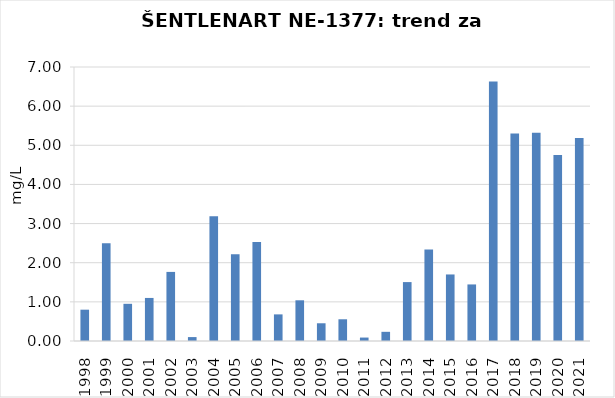
| Category | Vsota |
|---|---|
| 1998 | 0.8 |
| 1999 | 2.5 |
| 2000 | 0.95 |
| 2001 | 1.1 |
| 2002 | 1.765 |
| 2003 | 0.1 |
| 2004 | 3.19 |
| 2005 | 2.215 |
| 2006 | 2.53 |
| 2007 | 0.68 |
| 2008 | 1.04 |
| 2009 | 0.453 |
| 2010 | 0.555 |
| 2011 | 0.088 |
| 2012 | 0.234 |
| 2013 | 1.505 |
| 2014 | 2.335 |
| 2015 | 1.7 |
| 2016 | 1.445 |
| 2017 | 6.63 |
| 2018 | 5.3 |
| 2019 | 5.32 |
| 2020 | 4.755 |
| 2021 | 5.185 |